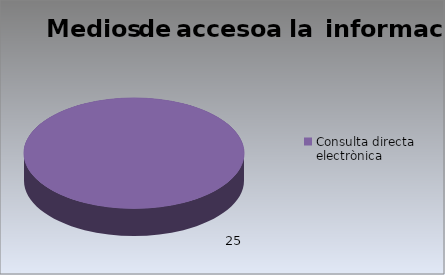
| Category | Series 0 |
|---|---|
| Consulta directa electrònica | 25 |